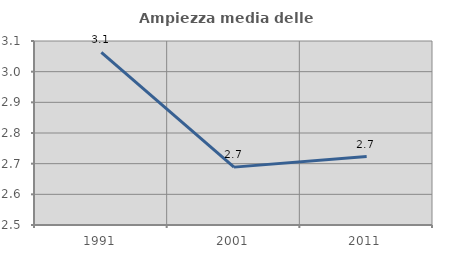
| Category | Ampiezza media delle famiglie |
|---|---|
| 1991.0 | 3.063 |
| 2001.0 | 2.689 |
| 2011.0 | 2.723 |